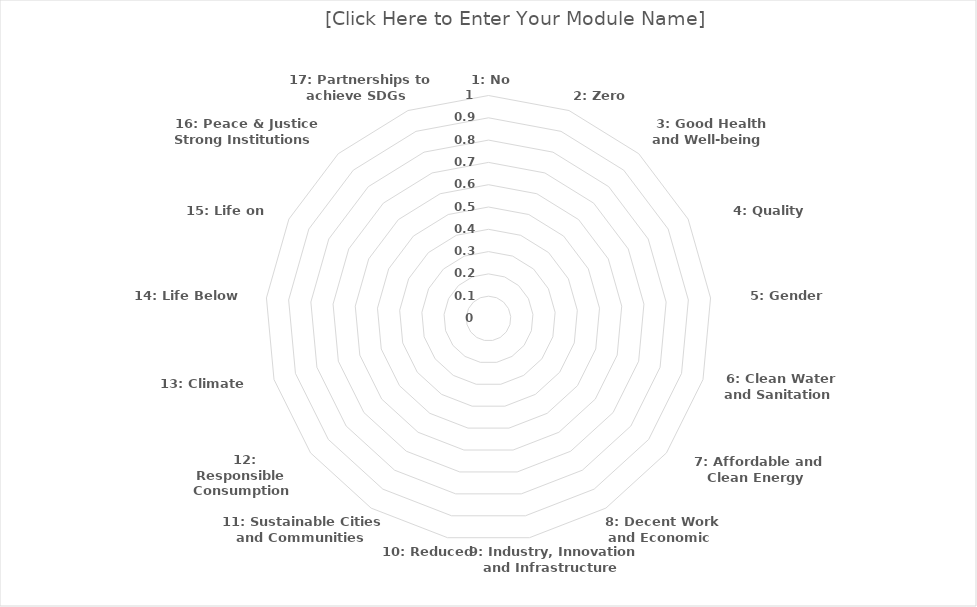
| Category | Series 0 |
|---|---|
|  1: No Poverty | 0 |
|  2: Zero Hunger | 0 |
|  3: Good Health and Well-being | 0 |
|  4: Quality Education | 0 |
|  5: Gender Equality | 0 |
|  6: Clean Water and Sanitation | 0 |
|  7: Affordable and Clean Energy | 0 |
|  8: Decent Work and Economic Growth | 0 |
|  9: Industry, Innovation and Infrastructure | 0 |
|  10: Reduced Inequality | 0 |
|  11: Sustainable Cities and Communities | 0 |
|  12: Responsible Consumption and Production | 0 |
|  13: Climate Action | 0 |
|  14: Life Below Water | 0 |
|  15: Life on Land | 0 |
|  16: Peace & Justice Strong Institutions | 0 |
|  17: Partnerships to achieve SDGs  | 0 |